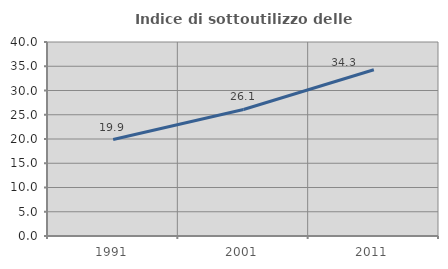
| Category | Indice di sottoutilizzo delle abitazioni  |
|---|---|
| 1991.0 | 19.888 |
| 2001.0 | 26.087 |
| 2011.0 | 34.278 |